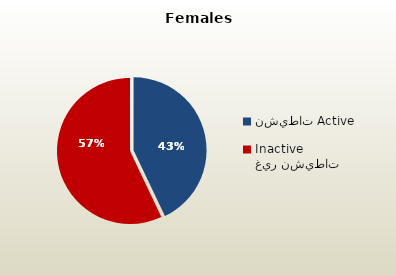
| Category | الاناث القطريات  Qatari Females |
|---|---|
| نشيطات Active | 48505 |
| غير نشيطات Inactive | 64474 |